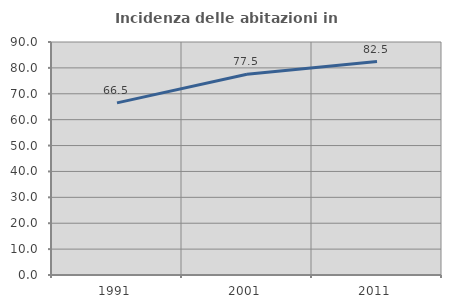
| Category | Incidenza delle abitazioni in proprietà  |
|---|---|
| 1991.0 | 66.488 |
| 2001.0 | 77.548 |
| 2011.0 | 82.463 |